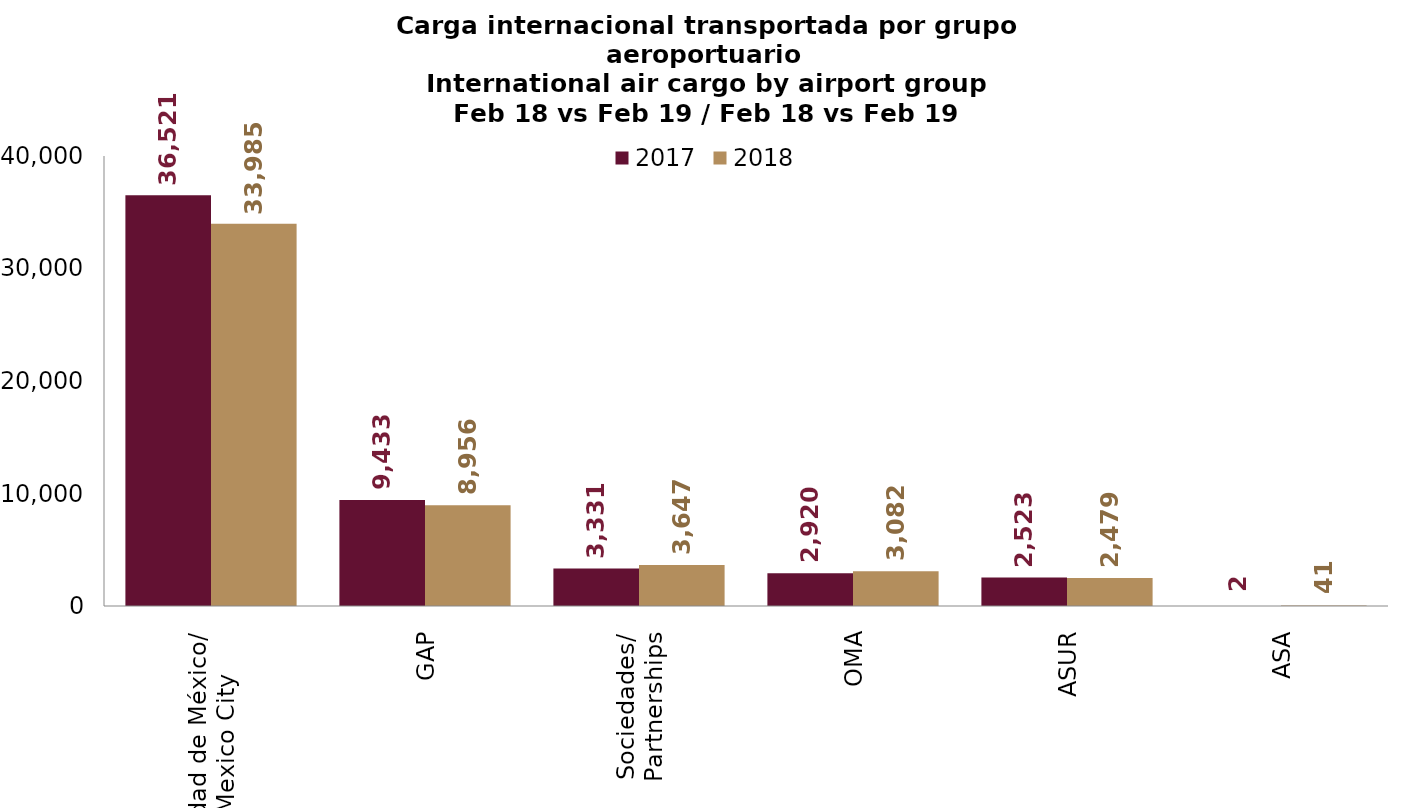
| Category | 2017 | 2018 |
|---|---|---|
| Ciudad de México/
Mexico City | 36520.55 | 33985.24 |
| GAP | 9432.801 | 8956.42 |
| Sociedades/
Partnerships | 3331.291 | 3646.951 |
| OMA | 2920.135 | 3081.877 |
| ASUR | 2522.521 | 2478.918 |
| ASA | 2.17 | 41.267 |